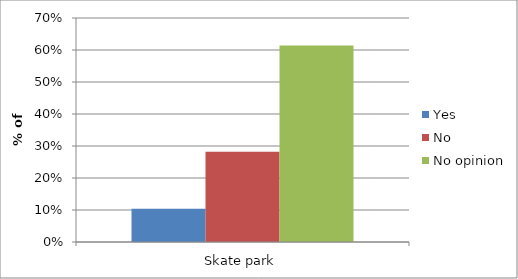
| Category | Yes | No | No opinion |
|---|---|---|---|
| Skate park | 0.104 | 0.282 | 0.614 |